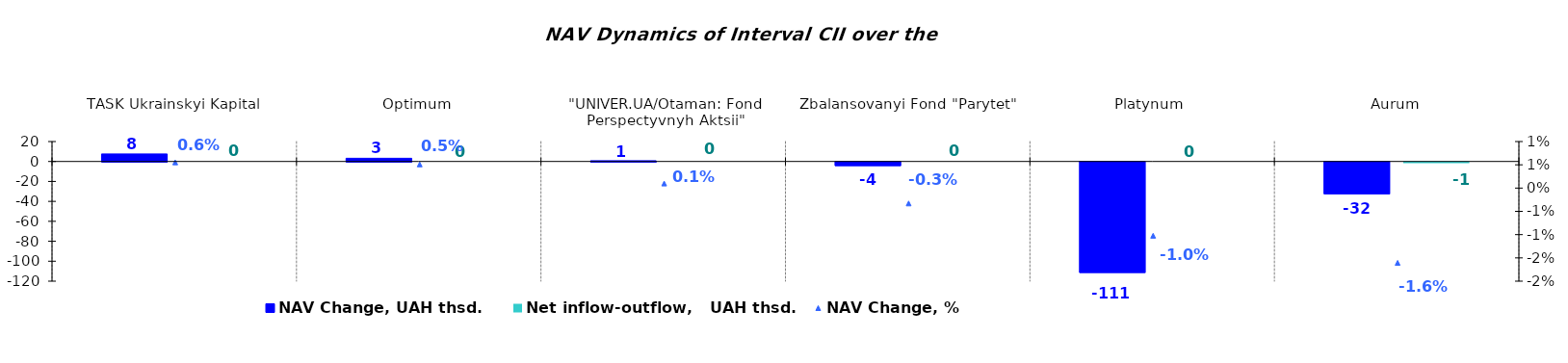
| Category | NAV Change, UAH thsd. | Net inflow-outflow,   UAH thsd. |
|---|---|---|
| TASK Ukrainskyi Kapital | 7.555 | 0 |
| Optimum | 3.22 | 0 |
| "UNIVER.UA/Otaman: Fond Perspectyvnyh Aktsii" | 0.768 | 0 |
| Zbalansovanyi Fond "Parytet" | -3.613 | 0 |
| Platynum  | -110.79 | 0 |
| Аurum | -31.907 | -0.86 |